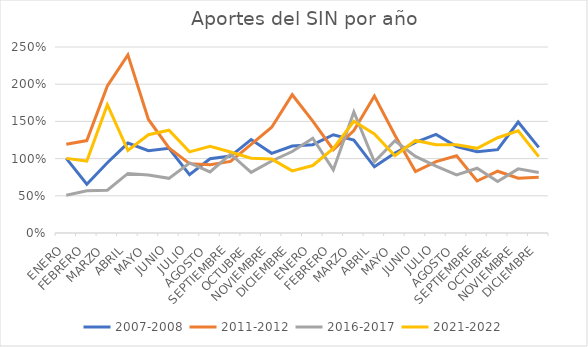
| Category | 2007-2008 | 2011-2012 | 2016-2017 | 2021-2022 |
|---|---|---|---|---|
| ENERO | 1.003 | 1.193 | 0.508 | 1.003 |
| FEBRERO | 0.656 | 1.242 | 0.568 | 0.967 |
| MARZO | 0.944 | 1.976 | 0.576 | 1.724 |
| ABRIL | 1.209 | 2.394 | 0.8 | 1.11 |
| MAYO | 1.106 | 1.526 | 0.781 | 1.321 |
| JUNIO | 1.138 | 1.143 | 0.735 | 1.381 |
| JULIO | 0.784 | 0.932 | 0.942 | 1.09 |
| AGOSTO | 0.998 | 0.917 | 0.821 | 1.165 |
| SEPTIEMBRE | 1.034 | 0.963 | 1.059 | 1.089 |
| OCTUBRE | 1.256 | 1.191 | 0.816 | 1.005 |
| NOVIEMBRE | 1.071 | 1.421 | 0.968 | 0.993 |
| DICIEMBRE | 1.169 | 1.859 | 1.095 | 0.835 |
| ENERO | 1.187 | 1.505 | 1.273 | 0.907 |
| FEBRERO | 1.321 | 1.12 | 0.848 | 1.137 |
| MARZO | 1.25 | 1.378 | 1.626 | 1.502 |
| ABRIL | 0.89 | 1.842 | 0.957 | 1.331 |
| MAYO | 1.076 | 1.314 | 1.24 | 1.038 |
| JUNIO | 1.218 | 0.826 | 1.03 | 1.244 |
| JULIO | 1.326 | 0.959 | 0.899 | 1.187 |
| AGOSTO | 1.163 | 1.039 | 0.78 | 1.187 |
| SEPTIEMBRE | 1.093 | 0.699 | 0.87 | 1.138 |
| OCTUBRE | 1.121 | 0.831 | 0.692 | 1.28 |
| NOVIEMBRE | 1.491 | 0.737 | 0.862 | 1.373 |
| DICIEMBRE | 1.151 | 0.751 | 0.814 | 1.027 |